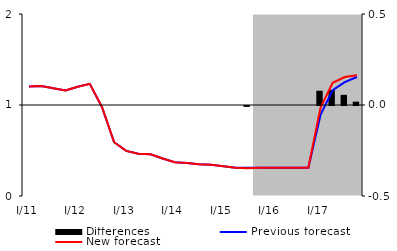
| Category | Differences |
|---|---|
| 0 | 0 |
| 1 | 0 |
| 2 | 0 |
| 3 | 0 |
| 4 | 0 |
| 5 | 0 |
| 6 | 0 |
| 7 | 0 |
| 8 | 0 |
| 9 | 0 |
| 10 | 0 |
| 11 | 0 |
| 12 | 0 |
| 13 | 0 |
| 14 | 0 |
| 15 | 0 |
| 16 | 0 |
| 17 | 0 |
| 18 | -0.005 |
| 19 | 0 |
| 20 | 0 |
| 21 | 0 |
| 22 | 0 |
| 23 | 0 |
| 24 | 0.078 |
| 25 | 0.082 |
| 26 | 0.056 |
| 27 | 0.018 |